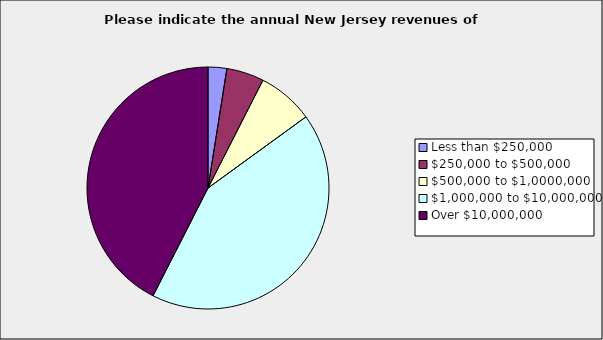
| Category | Series 0 |
|---|---|
| Less than $250,000 | 0.025 |
| $250,000 to $500,000 | 0.05 |
| $500,000 to $1,0000,000 | 0.075 |
| $1,000,000 to $10,000,000 | 0.425 |
| Over $10,000,000 | 0.425 |